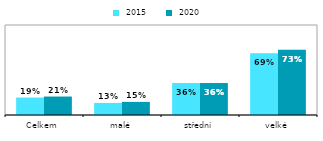
| Category |  2015 |  2020 |
|---|---|---|
| Celkem | 0.194 | 0.205 |
| malé | 0.134 | 0.146 |
| střední | 0.355 | 0.355 |
| velké | 0.687 | 0.726 |